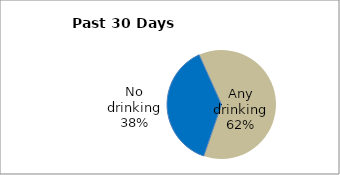
| Category | Series 0 |
|---|---|
| No drinking | 37.983 |
| Any drinking | 62.017 |